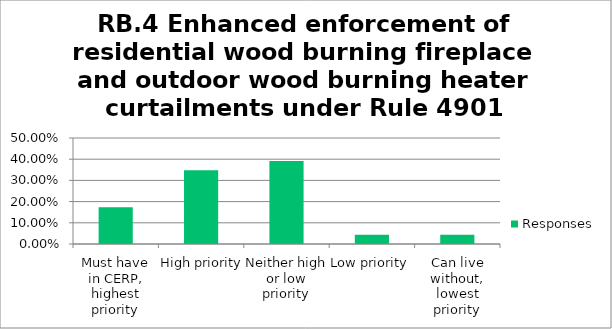
| Category | Responses |
|---|---|
| Must have in CERP, highest priority | 0.174 |
| High priority | 0.348 |
| Neither high or low priority | 0.391 |
| Low priority | 0.044 |
| Can live without, lowest priority | 0.044 |